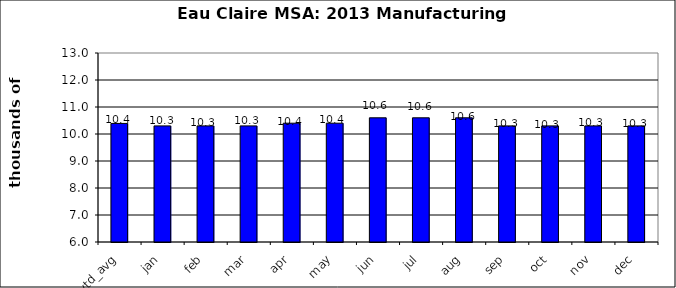
| Category | 2014 |
|---|---|
| ytd_avg | 10.392 |
| jan | 10.3 |
| feb | 10.3 |
| mar | 10.3 |
| apr | 10.4 |
| may | 10.4 |
| jun | 10.6 |
| jul | 10.6 |
| aug | 10.6 |
| sep | 10.3 |
| oct | 10.3 |
| nov | 10.3 |
| dec | 10.3 |